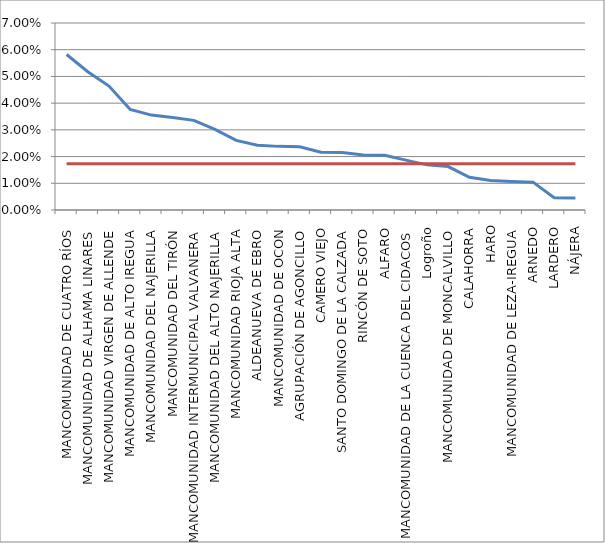
| Category | Series 0 | Series 1 |
|---|---|---|
| MANCOMUNIDAD DE CUATRO RÍOS | 0.058 | 0.017 |
| MANCOMUNIDAD DE ALHAMA LINARES | 0.052 | 0.017 |
| MANCOMUNIDAD VIRGEN DE ALLENDE | 0.046 | 0.017 |
| MANCOMUNIDAD DE ALTO IREGUA | 0.038 | 0.017 |
| MANCOMUNIDAD DEL NAJERILLA | 0.036 | 0.017 |
| MANCOMUNIDAD DEL TIRÓN | 0.035 | 0.017 |
| MANCOMUNIDAD INTERMUNICIPAL VALVANERA | 0.034 | 0.017 |
| MANCOMUNIDAD DEL ALTO NAJERILLA | 0.03 | 0.017 |
| MANCOMUNIDAD RIOJA ALTA | 0.026 | 0.017 |
| ALDEANUEVA DE EBRO | 0.024 | 0.017 |
| MANCOMUNIDAD DE OCON | 0.024 | 0.017 |
| AGRUPACIÓN DE AGONCILLO | 0.024 | 0.017 |
| CAMERO VIEJO | 0.022 | 0.017 |
| SANTO DOMINGO DE LA CALZADA | 0.021 | 0.017 |
| RINCÓN DE SOTO | 0.021 | 0.017 |
| ALFARO | 0.02 | 0.017 |
| MANCOMUNIDAD DE LA CUENCA DEL CIDACOS | 0.019 | 0.017 |
| Logroño | 0.017 | 0.017 |
| MANCOMUNIDAD DE MONCALVILLO | 0.016 | 0.017 |
| CALAHORRA | 0.012 | 0.017 |
| HARO | 0.011 | 0.017 |
| MANCOMUNIDAD DE LEZA-IREGUA | 0.011 | 0.017 |
| ARNEDO | 0.01 | 0.017 |
| LARDERO | 0.005 | 0.017 |
| NÁJERA | 0.004 | 0.017 |